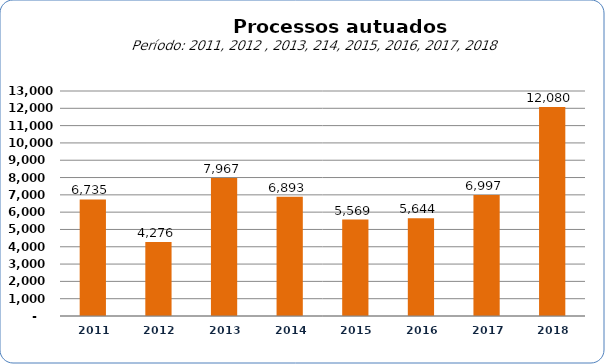
| Category |  6.735   4.276   7.967   6.893   5.569   5.644   6.997   12.080  |
|---|---|
| 2011 | 6735 |
| 2012 | 4276 |
| 2013 | 7967 |
| 2014 | 6893 |
| 2015 | 5569 |
| 2016 | 5644 |
| 2017 | 6997 |
| 2018 | 12080 |